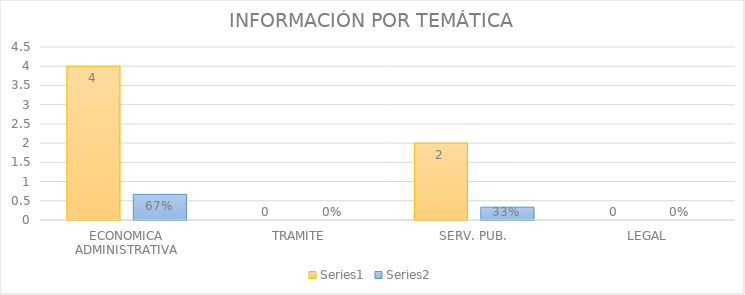
| Category | Series 3 | Series 4 |
|---|---|---|
| ECONOMICA ADMINISTRATIVA | 4 | 0.667 |
| TRAMITE | 0 | 0 |
| SERV. PUB. | 2 | 0.333 |
| LEGAL | 0 | 0 |